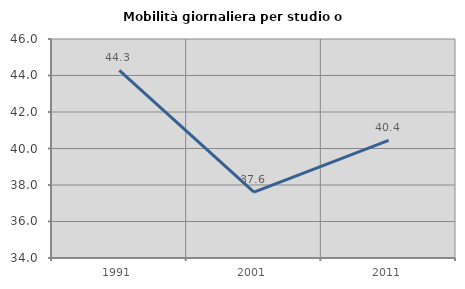
| Category | Mobilità giornaliera per studio o lavoro |
|---|---|
| 1991.0 | 44.286 |
| 2001.0 | 37.612 |
| 2011.0 | 40.441 |